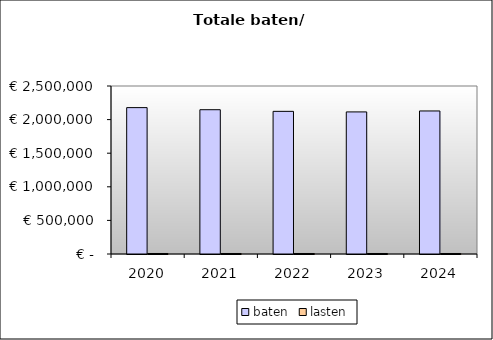
| Category | baten | lasten |
|---|---|---|
| 2020.0 | 2178373.436 | 7507.2 |
| 2021.0 | 2147256.131 | 7507.2 |
| 2022.0 | 2122820.08 | 7507.2 |
| 2023.0 | 2114457.475 | 7507.2 |
| 2024.0 | 2128597.695 | 7507.2 |